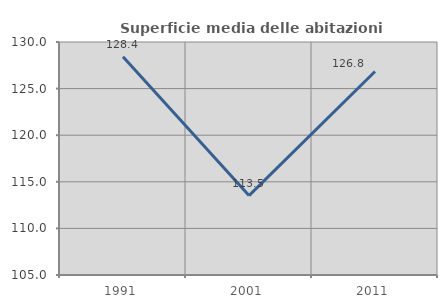
| Category | Superficie media delle abitazioni occupate |
|---|---|
| 1991.0 | 128.429 |
| 2001.0 | 113.523 |
| 2011.0 | 126.838 |